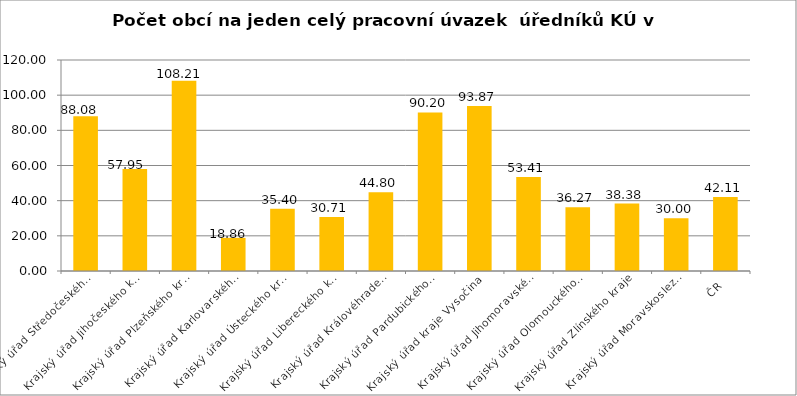
| Category | Počet obcí na jeden celý pracovní úvazek  úředníků KÚ |
|---|---|
| Krajský úřad Středočeského kraje | 88.08 |
| Krajský úřad Jihočeského kraje | 57.95 |
| Krajský úřad Plzeňského kraje | 108.21 |
| Krajský úřad Karlovarského kraje | 18.86 |
| Krajský úřad Ústeckého kraje | 35.4 |
| Krajský úřad Libereckého kraje | 30.71 |
| Krajský úřad Královéhradeckého kraje | 44.8 |
| Krajský úřad Pardubického kraje | 90.2 |
| Krajský úřad kraje Vysočina | 93.87 |
| Krajský úřad Jihomoravského kraje | 53.41 |
| Krajský úřad Olomouckého kraje | 36.27 |
| Krajský úřad Zlínského kraje | 38.38 |
| Krajský úřad Moravskoslezského kraje | 30 |
| ČR | 42.11 |